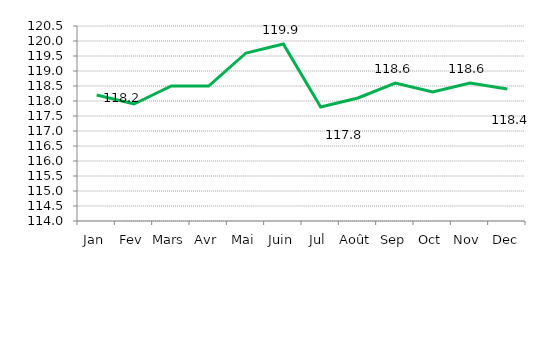
| Category | Series 0 |
|---|---|
| Jan | 118.2 |
| Fev | 117.9 |
| Mars | 118.5 |
| Avr | 118.5 |
| Mai | 119.6 |
| Juin | 119.9 |
| Jul | 117.8 |
| Août | 118.1 |
| Sep | 118.6 |
| Oct | 118.3 |
| Nov | 118.6 |
| Dec | 118.4 |